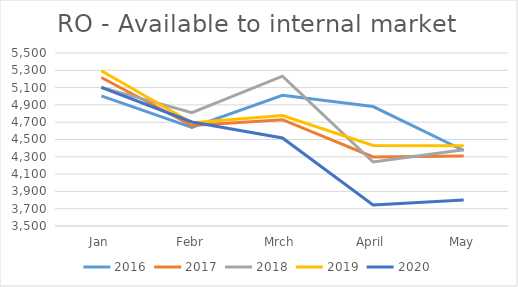
| Category | 2016 | 2017 | 2018 | 2019 | 2020 |
|---|---|---|---|---|---|
| Jan | 5004 | 5217 | 5103 | 5295 | 5102 |
| Febr | 4641 | 4662 | 4811 | 4694 | 4703 |
| Mrch | 5012 | 4729 | 5232 | 4776 | 4517 |
| April | 4881 | 4299 | 4240 | 4431 | 3742 |
| May | 4373 | 4310 | 4382 | 4427 | 3801 |